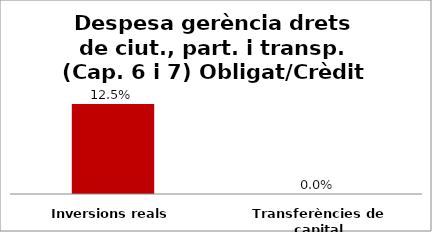
| Category | Series 0 |
|---|---|
| Inversions reals | 0.125 |
| Transferències de capital | 0 |